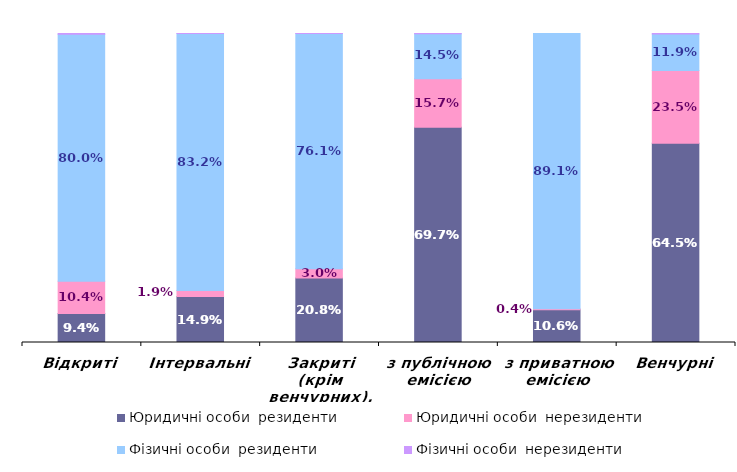
| Category | Юридичні особи  | Фізичні особи  |
|---|---|---|
| Відкриті | 0.104 | 0.002 |
| Інтервальні | 0.019 | 0 |
| Закриті (крім венчурних), у т. ч.: | 0.03 | 0 |
| з публічною емісією | 0.157 | 0.001 |
| з приватною емісією | 0.004 | 0 |
| Венчурні | 0.235 | 0.001 |